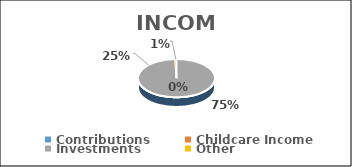
| Category | Series 0 | Series 1 |
|---|---|---|
| Contributions | 0.746 | 0.746 |
| Childcare Income | 0.249 | 0.249 |
| Investments | 0 | 0 |
| Other | 0.006 | 0.006 |